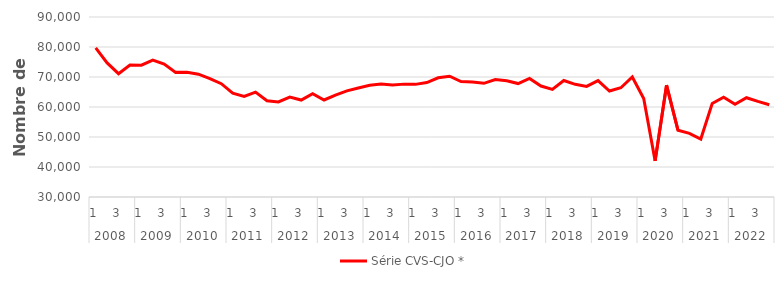
| Category | Série CVS-CJO * |
|---|---|
| 0 | 79703.818 |
| 1 | 74685.194 |
| 2 | 71097.009 |
| 3 | 74014.962 |
| 4 | 73950.027 |
| 5 | 75658.885 |
| 6 | 74302.366 |
| 7 | 71544.234 |
| 8 | 71614.496 |
| 9 | 70940.784 |
| 10 | 69461.953 |
| 11 | 67763.747 |
| 12 | 64591.869 |
| 13 | 63515.716 |
| 14 | 64955.261 |
| 15 | 62061.852 |
| 16 | 61665.145 |
| 17 | 63284.341 |
| 18 | 62323.804 |
| 19 | 64438.733 |
| 20 | 62344.748 |
| 21 | 63962.98 |
| 22 | 65384.137 |
| 23 | 66340.617 |
| 24 | 67226.189 |
| 25 | 67642.427 |
| 26 | 67361.009 |
| 27 | 67624.543 |
| 28 | 67546.447 |
| 29 | 68139.747 |
| 30 | 69723.78 |
| 31 | 70244.717 |
| 32 | 68462.036 |
| 33 | 68309.088 |
| 34 | 67894.87 |
| 35 | 69178.553 |
| 36 | 68723.08 |
| 37 | 67810.363 |
| 38 | 69539.429 |
| 39 | 66987.296 |
| 40 | 65856.737 |
| 41 | 68837.073 |
| 42 | 67557.455 |
| 43 | 66878.816 |
| 44 | 68786.034 |
| 45 | 65311.944 |
| 46 | 66413.18 |
| 47 | 70001.549 |
| 48 | 62859.905 |
| 49 | 42047.613 |
| 50 | 67273.7 |
| 51 | 52276.364 |
| 52 | 51200.641 |
| 53 | 49324.59 |
| 54 | 61187.829 |
| 55 | 63256.203 |
| 56 | 60904.834 |
| 57 | 63096.927 |
| 58 | 61864.744 |
| 59 | 60752.825 |